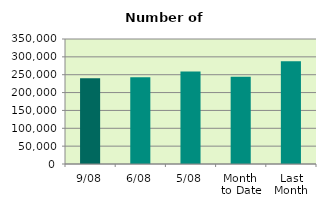
| Category | Series 0 |
|---|---|
| 9/08 | 239882 |
| 6/08 | 243076 |
| 5/08 | 259222 |
| Month 
to Date | 244385.333 |
| Last
Month | 287917.636 |